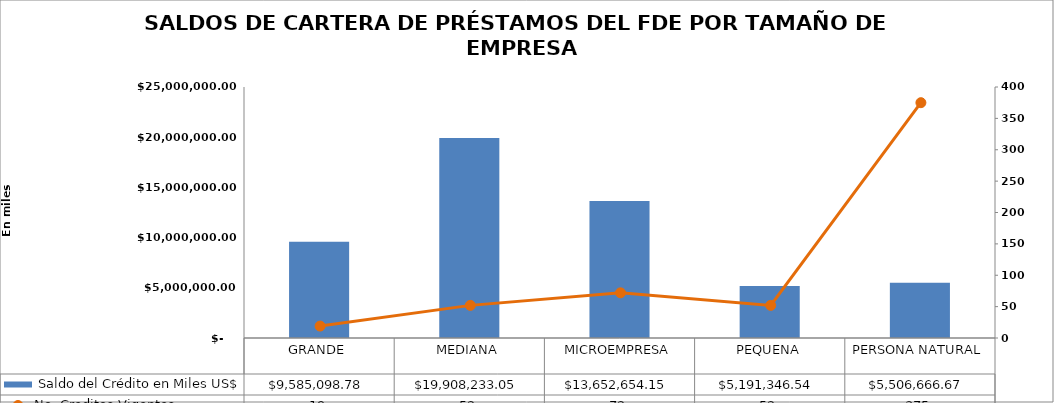
| Category |  Saldo del Crédito en Miles US$ |
|---|---|
| GRANDE | 9585098.78 |
| MEDIANA | 19908233.05 |
| MICROEMPRESA | 13652654.15 |
| PEQUENA | 5191346.54 |
| PERSONA NATURAL | 5506666.67 |